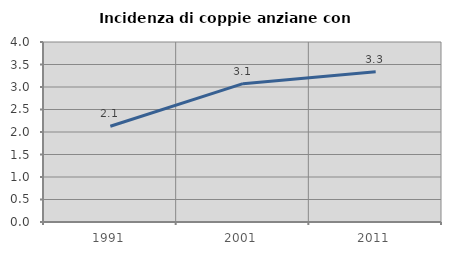
| Category | Incidenza di coppie anziane con figli |
|---|---|
| 1991.0 | 2.128 |
| 2001.0 | 3.074 |
| 2011.0 | 3.341 |